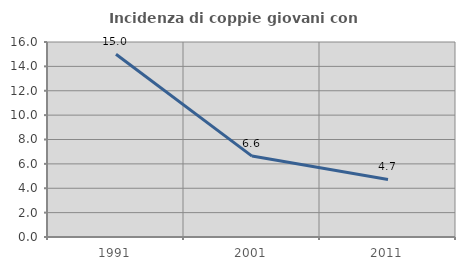
| Category | Incidenza di coppie giovani con figli |
|---|---|
| 1991.0 | 14.994 |
| 2001.0 | 6.639 |
| 2011.0 | 4.719 |